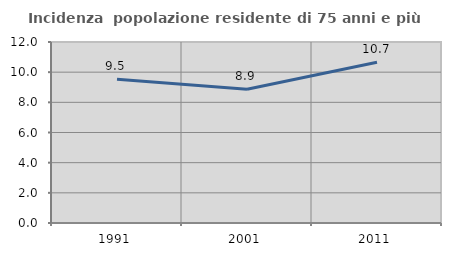
| Category | Incidenza  popolazione residente di 75 anni e più |
|---|---|
| 1991.0 | 9.534 |
| 2001.0 | 8.868 |
| 2011.0 | 10.662 |